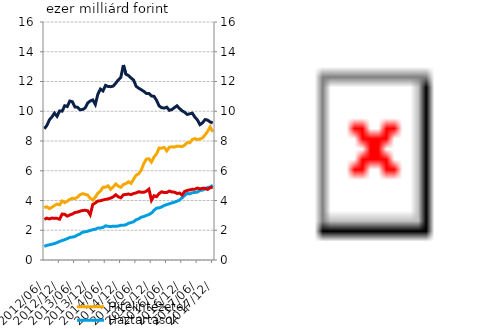
| Category | Hitelintézetek | Háztartások |
|---|---|---|
| 2012-06-30 | 3.522 | 0.913 |
| 2012-07-31 | 3.581 | 0.984 |
| 2012-08-31 | 3.45 | 1.023 |
| 2012-09-30 | 3.547 | 1.06 |
| 2012-10-31 | 3.66 | 1.107 |
| 2012-11-30 | 3.762 | 1.168 |
| 2012-12-31 | 3.703 | 1.246 |
| 2013-01-31 | 3.965 | 1.311 |
| 2013-02-28 | 3.854 | 1.364 |
| 2013-03-31 | 3.951 | 1.436 |
| 2013-04-30 | 4.077 | 1.516 |
| 2013-05-31 | 4.152 | 1.541 |
| 2013-06-30 | 4.122 | 1.58 |
| 2013-07-31 | 4.225 | 1.681 |
| 2013-08-31 | 4.38 | 1.75 |
| 2013-09-30 | 4.46 | 1.872 |
| 2013-10-31 | 4.414 | 1.893 |
| 2013-11-30 | 4.366 | 1.935 |
| 2013-12-31 | 4.145 | 1.991 |
| 2014-01-31 | 4.032 | 2.036 |
| 2014-02-28 | 4.224 | 2.07 |
| 2014-03-31 | 4.491 | 2.148 |
| 2014-04-30 | 4.631 | 2.151 |
| 2014-05-31 | 4.888 | 2.186 |
| 2014-06-30 | 4.883 | 2.301 |
| 2014-07-31 | 4.984 | 2.265 |
| 2014-08-31 | 4.755 | 2.248 |
| 2014-09-30 | 4.91 | 2.27 |
| 2014-10-31 | 5.11 | 2.262 |
| 2014-11-30 | 4.966 | 2.287 |
| 2014-12-31 | 4.888 | 2.333 |
| 2015-01-31 | 5.077 | 2.336 |
| 2015-02-28 | 5.129 | 2.364 |
| 2015-03-31 | 5.259 | 2.472 |
| 2015-04-30 | 5.15 | 2.514 |
| 2015-05-31 | 5.437 | 2.57 |
| 2015-06-30 | 5.703 | 2.704 |
| 2015-07-31 | 5.799 | 2.766 |
| 2015-08-31 | 6.047 | 2.879 |
| 2015-09-30 | 6.487 | 2.922 |
| 2015-10-31 | 6.783 | 2.995 |
| 2015-11-30 | 6.806 | 3.051 |
| 2015-12-31 | 6.583 | 3.16 |
| 2016-01-31 | 6.924 | 3.34 |
| 2016-02-29 | 7.136 | 3.482 |
| 2016-03-31 | 7.526 | 3.506 |
| 2016-04-30 | 7.517 | 3.568 |
| 2016-05-31 | 7.568 | 3.667 |
| 2016-06-30 | 7.337 | 3.726 |
| 2016-07-31 | 7.579 | 3.779 |
| 2016-08-31 | 7.612 | 3.836 |
| 2016-09-30 | 7.589 | 3.888 |
| 2016-10-31 | 7.655 | 3.95 |
| 2016-11-30 | 7.646 | 4.034 |
| 2016-12-31 | 7.618 | 4.179 |
| 2017-01-31 | 7.727 | 4.344 |
| 2017-02-28 | 7.889 | 4.469 |
| 2017-03-31 | 7.879 | 4.451 |
| 2017-04-30 | 8.097 | 4.52 |
| 2017-05-31 | 8.164 | 4.543 |
| 2017-06-30 | 8.095 | 4.566 |
| 2017-07-31 | 8.135 | 4.683 |
| 2017-08-31 | 8.206 | 4.698 |
| 2017-09-30 | 8.405 | 4.767 |
| 2017-10-31 | 8.643 | 4.874 |
| 2017-11-30 | 8.949 | 4.902 |
| 2017-12-31 | 8.613 | 5.025 |